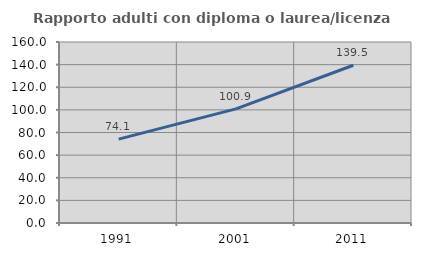
| Category | Rapporto adulti con diploma o laurea/licenza media  |
|---|---|
| 1991.0 | 74.134 |
| 2001.0 | 100.896 |
| 2011.0 | 139.458 |